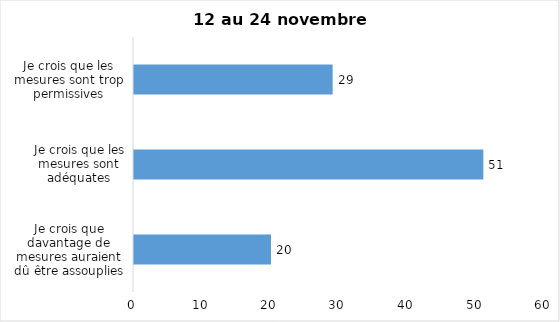
| Category | Series 0 |
|---|---|
| Je crois que davantage de mesures auraient dû être assouplies | 20 |
| Je crois que les mesures sont adéquates | 51 |
| Je crois que les mesures sont trop permissives | 29 |